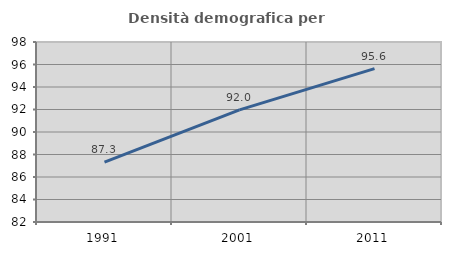
| Category | Densità demografica |
|---|---|
| 1991.0 | 87.32 |
| 2001.0 | 91.965 |
| 2011.0 | 95.634 |